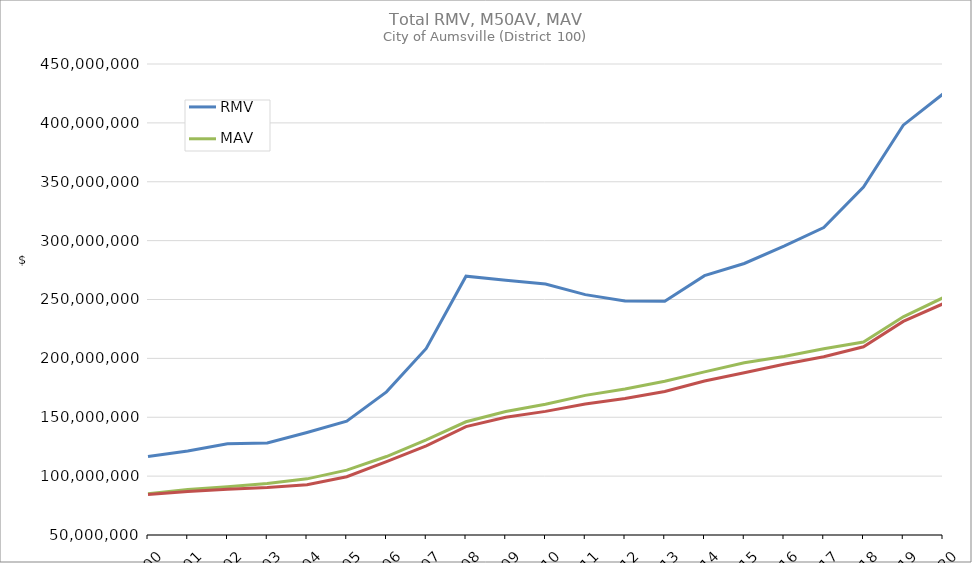
| Category | RMV | MAV | M50AV |
|---|---|---|---|
| 2000.0 | 116697660 | 85131447 | 84409255 |
| 2001.0 | 121262524 | 88723971 | 86965502 |
| 2002.0 | 127397716 | 90996700 | 88774338 |
| 2003.0 | 128069780 | 93705646 | 90252771 |
| 2004.0 | 137028873 | 97691512 | 92711028 |
| 2005.0 | 146671362 | 105111005 | 99482581 |
| 2006.0 | 171564912 | 116639566 | 112372379 |
| 2007.0 | 208430683 | 130832725 | 125721496 |
| 2008.0 | 269776810 | 146142762 | 142081448 |
| 2009.0 | 266402043 | 154927013 | 150015909 |
| 2010.0 | 263222168 | 161119093 | 154978332 |
| 2011.0 | 254120293 | 168572271 | 161251989 |
| 2012.0 | 248697368 | 174034964 | 165854046 |
| 2013.0 | 248494686 | 180648327 | 171858124 |
| 2014.0 | 270224460 | 188515676 | 180737115 |
| 2015.0 | 280600419 | 196233554 | 187828756 |
| 2016.0 | 295314152 | 201563797 | 195059790 |
| 2017.0 | 311062452 | 208093572 | 201349057 |
| 2018.0 | 345523765 | 213824763 | 209807314 |
| 2019.0 | 398048624 | 235263622 | 231374404 |
| 2020.0 | 424527809 | 251466313 | 246334772 |